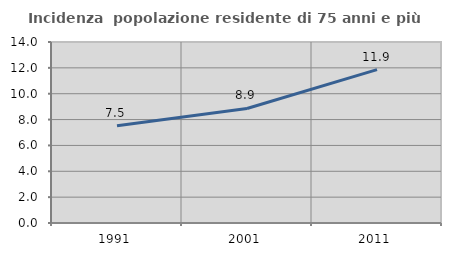
| Category | Incidenza  popolazione residente di 75 anni e più |
|---|---|
| 1991.0 | 7.517 |
| 2001.0 | 8.857 |
| 2011.0 | 11.866 |